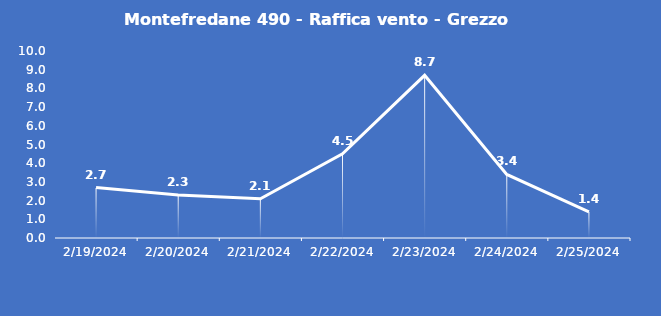
| Category | Montefredane 490 - Raffica vento - Grezzo (m/s) |
|---|---|
| 2/19/24 | 2.7 |
| 2/20/24 | 2.3 |
| 2/21/24 | 2.1 |
| 2/22/24 | 4.5 |
| 2/23/24 | 8.7 |
| 2/24/24 | 3.4 |
| 2/25/24 | 1.4 |